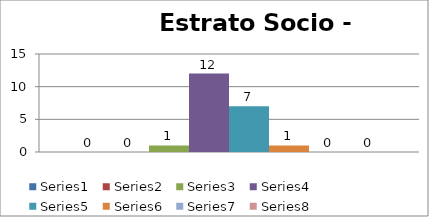
| Category | Series 0 | Series 1 | Series 2 | Series 3 | Series 4 | Series 5 | Series 6 | Series 7 |
|---|---|---|---|---|---|---|---|---|
| 0 | 0 | 0 | 1 | 12 | 7 | 1 | 0 | 0 |